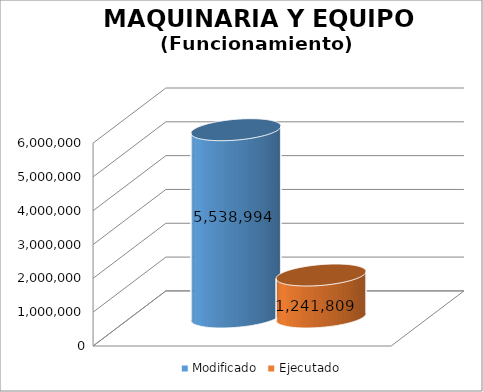
| Category | Modificado | Ejecutado |
|---|---|---|
| 0 | 5538994 | 1241809.03 |